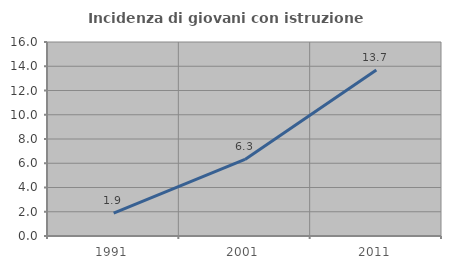
| Category | Incidenza di giovani con istruzione universitaria |
|---|---|
| 1991.0 | 1.887 |
| 2001.0 | 6.311 |
| 2011.0 | 13.699 |